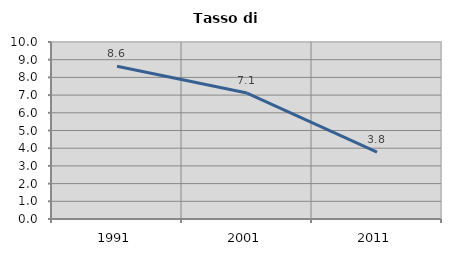
| Category | Tasso di disoccupazione   |
|---|---|
| 1991.0 | 8.632 |
| 2001.0 | 7.115 |
| 2011.0 | 3.781 |